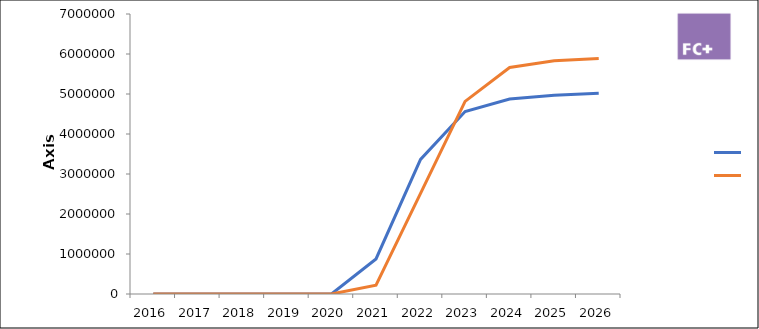
| Category | Product X | Product Y |
|---|---|---|
| 2016 | 0 | 0 |
| 2017 | 0 | 0 |
| 2018 | 0 | 0 |
| 2019 | 0 | 0 |
| 2020 | 0 | 0 |
| 2021 | 876113.744 | 218386.698 |
| 2022 | 3364313.278 | 2517066.828 |
| 2023 | 4563412.416 | 4815790.282 |
| 2024 | 4873139.036 | 5662165.025 |
| 2025 | 4971592.687 | 5830744.246 |
| 2026 | 5021308.614 | 5889051.689 |